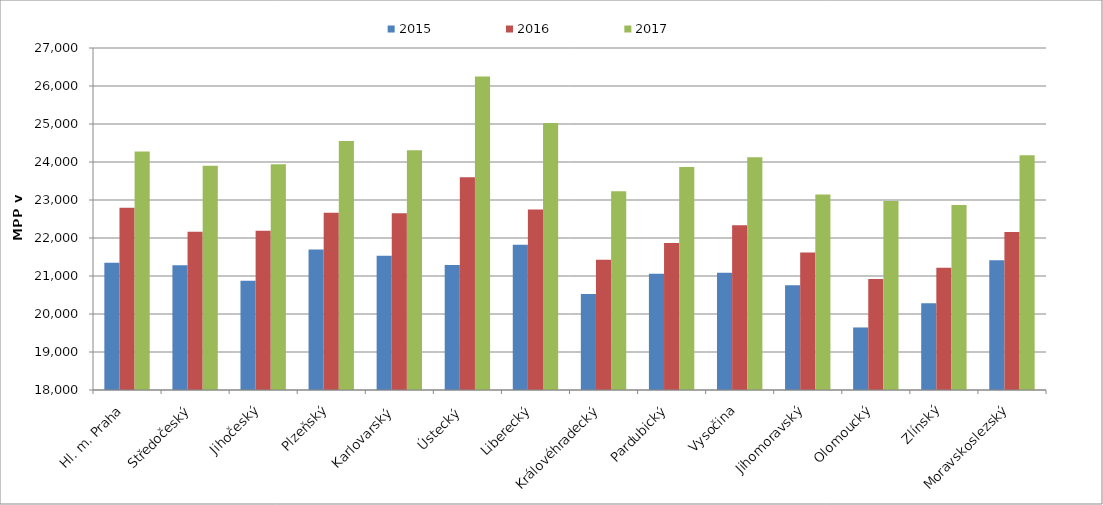
| Category | 2015 | 2016 | 2017 |
|---|---|---|---|
| Hl. m. Praha | 21349.608 | 22795.104 | 24278.641 |
| Středočeský | 21280.437 | 22161.702 | 23903.813 |
| Jihočeský | 20874.172 | 22189.65 | 23940.674 |
| Plzeňský | 21694.81 | 22661.503 | 24550.117 |
| Karlovarský  | 21529.699 | 22652.563 | 24312.449 |
| Ústecký   | 21286.957 | 23598.351 | 26247.405 |
| Liberecký | 21822.901 | 22750.586 | 25024.905 |
| Královéhradecký | 20526.172 | 21428.702 | 23228.768 |
| Pardubický | 21057.218 | 21865.723 | 23870.283 |
| Vysočina | 21084.14 | 22337.696 | 24124.868 |
| Jihomoravský | 20753.523 | 21616.192 | 23143.116 |
| Olomoucký | 19645.818 | 20920.874 | 22975.632 |
| Zlínský | 20280.221 | 21217.725 | 22867.509 |
| Moravskoslezský | 21417.49 | 22156.654 | 24175.115 |